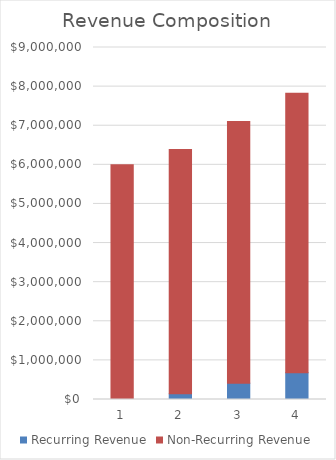
| Category | Recurring Revenue | Non-Recurring Revenue |
|---|---|---|
| 1.0 | 0 | 6000000 |
| 2.0 | 146250 | 6243750 |
| 3.0 | 416250 | 6693750 |
| 4.0 | 686250 | 7143750 |